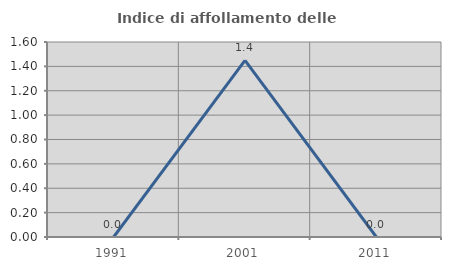
| Category | Indice di affollamento delle abitazioni  |
|---|---|
| 1991.0 | 0 |
| 2001.0 | 1.449 |
| 2011.0 | 0 |